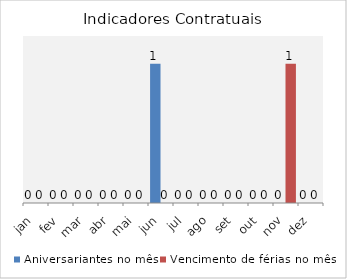
| Category | Aniversariantes no mês | Vencimento de férias no mês |
|---|---|---|
| jan | 0 | 0 |
| fev | 0 | 0 |
| mar | 0 | 0 |
| abr | 0 | 0 |
| mai | 0 | 0 |
| jun | 1 | 0 |
| jul | 0 | 0 |
| ago | 0 | 0 |
| set | 0 | 0 |
| out | 0 | 0 |
| nov | 0 | 1 |
| dez | 0 | 0 |